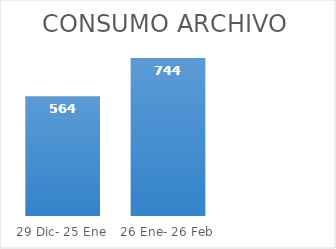
| Category | Series 0 |
|---|---|
| 29 Dic- 25 Ene | 564 |
| 26 Ene- 26 Feb | 744 |